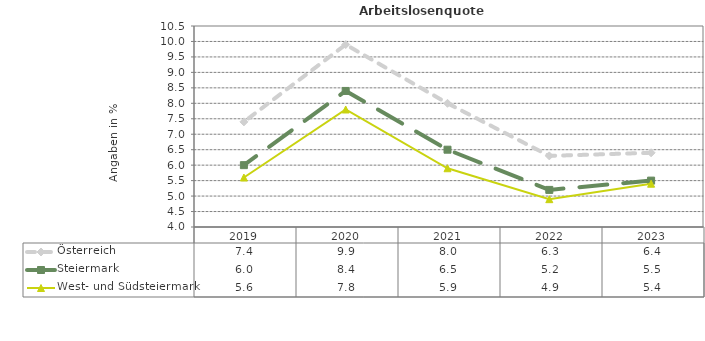
| Category | Österreich | Steiermark | West- und Südsteiermark |
|---|---|---|---|
| 2023.0 | 6.4 | 5.5 | 5.4 |
| 2022.0 | 6.3 | 5.2 | 4.9 |
| 2021.0 | 8 | 6.5 | 5.9 |
| 2020.0 | 9.9 | 8.4 | 7.8 |
| 2019.0 | 7.4 | 6 | 5.6 |